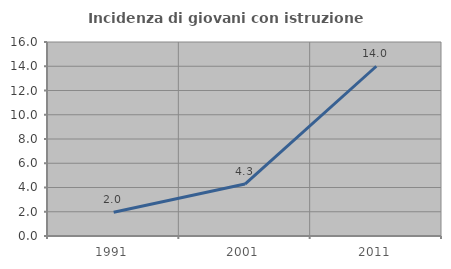
| Category | Incidenza di giovani con istruzione universitaria |
|---|---|
| 1991.0 | 1.961 |
| 2001.0 | 4.286 |
| 2011.0 | 14 |